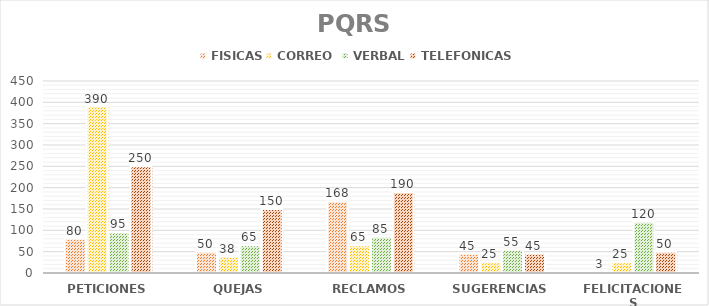
| Category | FISICAS | CORREO  | VERBAL | TELEFONICAS |
|---|---|---|---|---|
| PETICIONES | 80 | 390 | 95 | 250 |
| QUEJAS | 50 | 38 | 65 | 150 |
| RECLAMOS | 168 | 65 | 85 | 190 |
| SUGERENCIAS | 45 | 25 | 55 | 45 |
| FELICITACIONES | 3 | 25 | 120 | 50 |